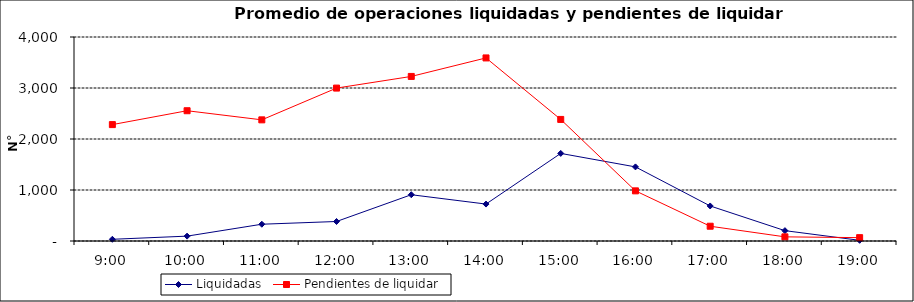
| Category | Liquidadas | Pendientes de liquidar |
|---|---|---|
| 0.375 | 33.591 | 2282.182 |
| 0.4166666666666667 | 95.318 | 2554.318 |
| 0.4583333333333333 | 328.909 | 2375.545 |
| 0.5 | 382.545 | 2998.364 |
| 0.5416666666666666 | 907.364 | 3227 |
| 0.5833333333333334 | 724 | 3589.682 |
| 0.625 | 1717.455 | 2383.727 |
| 0.6666666666666666 | 1453 | 983.227 |
| 0.7083333333333334 | 687.136 | 289.682 |
| 0.75 | 203.091 | 81.227 |
| 0.7916666666666666 | 13.318 | 65.864 |